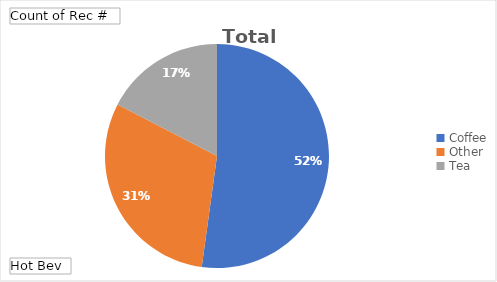
| Category | Total |
|---|---|
| Coffee | 12 |
| Other | 7 |
| Tea | 4 |